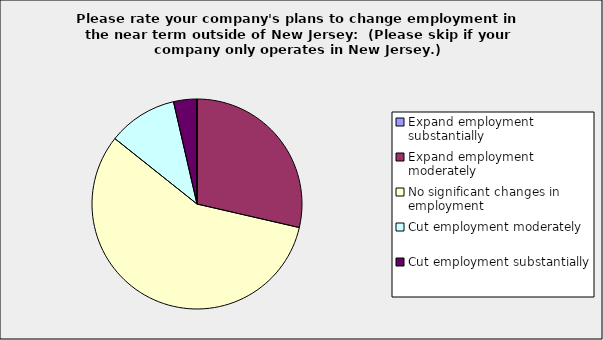
| Category | Series 0 |
|---|---|
| Expand employment substantially | 0 |
| Expand employment moderately | 0.286 |
| No significant changes in employment | 0.571 |
| Cut employment moderately | 0.107 |
| Cut employment substantially | 0.036 |